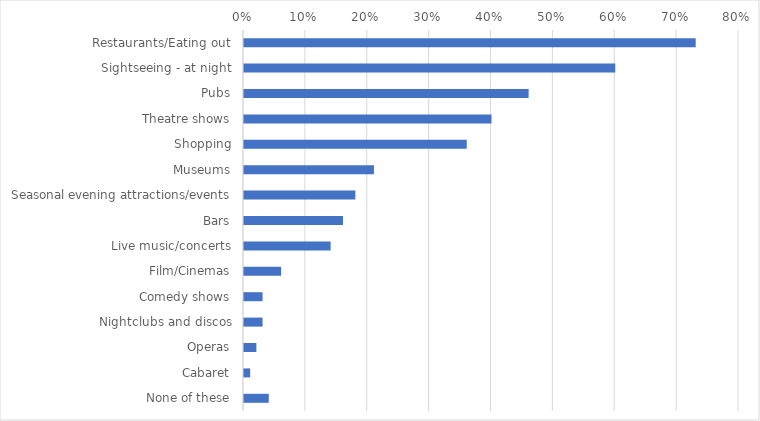
| Category | Percent |
|---|---|
| Restaurants/Eating out | 0.73 |
| Sightseeing - at night | 0.6 |
| Pubs | 0.46 |
| Theatre shows | 0.4 |
| Shopping | 0.36 |
| Museums | 0.21 |
| Seasonal evening attractions/events | 0.18 |
| Bars | 0.16 |
| Live music/concerts | 0.14 |
| Film/Cinemas | 0.06 |
| Comedy shows | 0.03 |
| Nightclubs and discos | 0.03 |
| Operas | 0.02 |
| Cabaret | 0.01 |
| None of these | 0.04 |